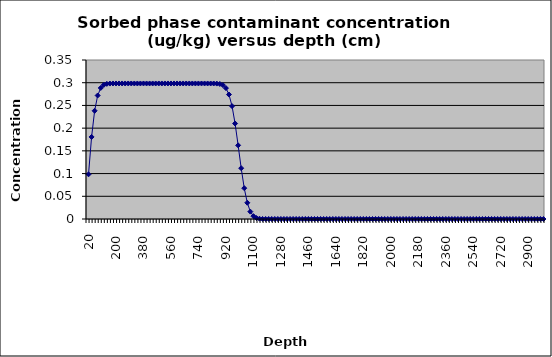
| Category | concentration |
|---|---|
| 20.0 | 0.098 |
| 40.0 | 0.181 |
| 60.0 | 0.238 |
| 80.0 | 0.272 |
| 100.0 | 0.288 |
| 120.0 | 0.295 |
| 140.0 | 0.297 |
| 160.0 | 0.298 |
| 180.0 | 0.298 |
| 200.0 | 0.298 |
| 220.0 | 0.298 |
| 240.0 | 0.298 |
| 260.0 | 0.298 |
| 280.0 | 0.298 |
| 300.0 | 0.298 |
| 320.0 | 0.298 |
| 340.0 | 0.298 |
| 360.0 | 0.298 |
| 380.0 | 0.298 |
| 400.0 | 0.298 |
| 420.0 | 0.298 |
| 440.0 | 0.298 |
| 460.0 | 0.298 |
| 480.0 | 0.298 |
| 500.0 | 0.298 |
| 520.0 | 0.298 |
| 540.0 | 0.298 |
| 560.0 | 0.298 |
| 580.0 | 0.298 |
| 600.0 | 0.298 |
| 620.0 | 0.298 |
| 640.0 | 0.298 |
| 660.0 | 0.298 |
| 680.0 | 0.298 |
| 700.0 | 0.298 |
| 720.0 | 0.298 |
| 740.0 | 0.298 |
| 760.0 | 0.298 |
| 780.0 | 0.298 |
| 800.0 | 0.298 |
| 820.0 | 0.298 |
| 840.0 | 0.298 |
| 860.0 | 0.298 |
| 880.0 | 0.297 |
| 900.0 | 0.295 |
| 920.0 | 0.288 |
| 940.0 | 0.274 |
| 960.0 | 0.248 |
| 980.0 | 0.21 |
| 1000.0 | 0.162 |
| 1020.0 | 0.112 |
| 1040.0 | 0.068 |
| 1060.0 | 0.036 |
| 1080.0 | 0.016 |
| 1100.0 | 0.006 |
| 1120.0 | 0.002 |
| 1140.0 | 0.001 |
| 1160.0 | 0 |
| 1180.0 | 0 |
| 1200.0 | 0 |
| 1220.0 | 0 |
| 1240.0 | 0 |
| 1260.0 | 0 |
| 1280.0 | 0 |
| 1300.0 | 0 |
| 1320.0 | 0 |
| 1340.0 | 0 |
| 1360.0 | 0 |
| 1380.0 | 0 |
| 1400.0 | 0 |
| 1420.0 | 0 |
| 1440.0 | 0 |
| 1460.0 | 0 |
| 1480.0 | 0 |
| 1500.0 | 0 |
| 1520.0 | 0 |
| 1540.0 | 0 |
| 1560.0 | 0 |
| 1580.0 | 0 |
| 1600.0 | 0 |
| 1620.0 | 0 |
| 1640.0 | 0 |
| 1660.0 | 0 |
| 1680.0 | 0 |
| 1700.0 | 0 |
| 1720.0 | 0 |
| 1740.0 | 0 |
| 1760.0 | 0 |
| 1780.0 | 0 |
| 1800.0 | 0 |
| 1820.0 | 0 |
| 1840.0 | 0 |
| 1860.0 | 0 |
| 1880.0 | 0 |
| 1900.0 | 0 |
| 1920.0 | 0 |
| 1940.0 | 0 |
| 1960.0 | 0 |
| 1980.0 | 0 |
| 2000.0 | 0 |
| 2020.0 | 0 |
| 2040.0 | 0 |
| 2060.0 | 0 |
| 2080.0 | 0 |
| 2100.0 | 0 |
| 2120.0 | 0 |
| 2140.0 | 0 |
| 2160.0 | 0 |
| 2180.0 | 0 |
| 2200.0 | 0 |
| 2220.0 | 0 |
| 2240.0 | 0 |
| 2260.0 | 0 |
| 2280.0 | 0 |
| 2300.0 | 0 |
| 2320.0 | 0 |
| 2340.0 | 0 |
| 2360.0 | 0 |
| 2380.0 | 0 |
| 2400.0 | 0 |
| 2420.0 | 0 |
| 2440.0 | 0 |
| 2460.0 | 0 |
| 2480.0 | 0 |
| 2500.0 | 0 |
| 2520.0 | 0 |
| 2540.0 | 0 |
| 2560.0 | 0 |
| 2580.0 | 0 |
| 2600.0 | 0 |
| 2620.0 | 0 |
| 2640.0 | 0 |
| 2660.0 | 0 |
| 2680.0 | 0 |
| 2700.0 | 0 |
| 2720.0 | 0 |
| 2740.0 | 0 |
| 2760.0 | 0 |
| 2780.0 | 0 |
| 2800.0 | 0 |
| 2820.0 | 0 |
| 2840.0 | 0 |
| 2860.0 | 0 |
| 2880.0 | 0 |
| 2900.0 | 0 |
| 2920.0 | 0 |
| 2940.0 | 0 |
| 2960.0 | 0 |
| 2980.0 | 0 |
| 3000.0 | 0 |